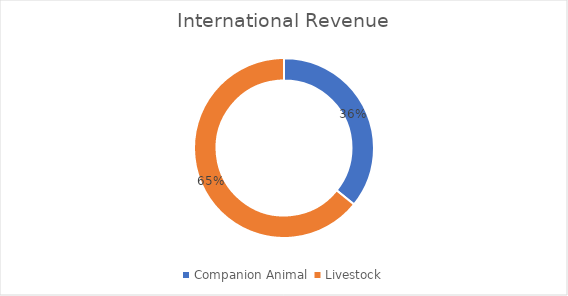
| Category | Series 0 |
|---|---|
| Companion Animal  | 0.362 |
| Livestock | 0.65 |